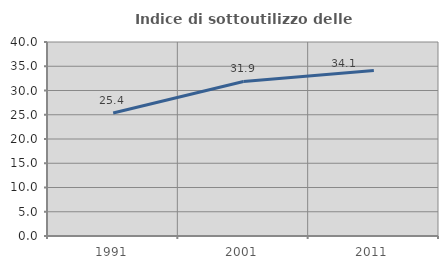
| Category | Indice di sottoutilizzo delle abitazioni  |
|---|---|
| 1991.0 | 25.356 |
| 2001.0 | 31.869 |
| 2011.0 | 34.139 |